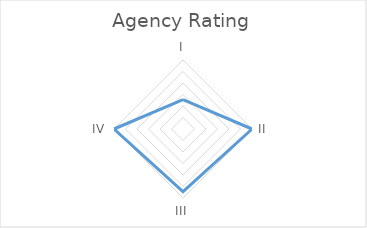
| Category | Series 0 |
|---|---|
| I | 1.273 |
| II | 3 |
| III | 2.727 |
| IV | 3 |